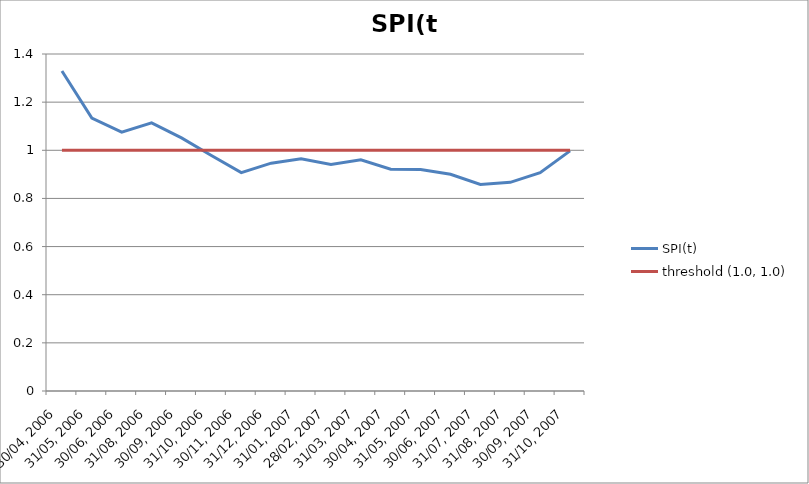
| Category | SPI(t) | threshold (1.0, 1.0) |
|---|---|---|
| 30/04, 2006 | 1.33 | 1 |
| 31/05, 2006 | 1.134 | 1 |
| 30/06, 2006 | 1.075 | 1 |
| 31/08, 2006 | 1.114 | 1 |
| 30/09, 2006 | 1.052 | 1 |
| 31/10, 2006 | 0.978 | 1 |
| 30/11, 2006 | 0.907 | 1 |
| 31/12, 2006 | 0.947 | 1 |
| 31/01, 2007 | 0.964 | 1 |
| 28/02, 2007 | 0.941 | 1 |
| 31/03, 2007 | 0.96 | 1 |
| 30/04, 2007 | 0.921 | 1 |
| 31/05, 2007 | 0.92 | 1 |
| 30/06, 2007 | 0.9 | 1 |
| 31/07, 2007 | 0.858 | 1 |
| 31/08, 2007 | 0.867 | 1 |
| 30/09, 2007 | 0.907 | 1 |
| 31/10, 2007 | 0.998 | 1 |